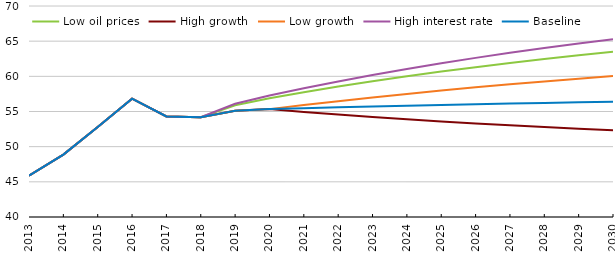
| Category | Low oil prices | High growth | Low growth | High interest rate | Baseline |
|---|---|---|---|---|---|
| 2013-01-01 | 45.886 | 45.886 | 45.886 | 45.886 | 45.886 |
| 2014-01-01 | 48.868 | 48.868 | 48.868 | 48.868 | 48.868 |
| 2015-01-01 | 52.802 | 52.802 | 52.802 | 52.802 | 52.802 |
| 2016-01-01 | 56.825 | 56.825 | 56.825 | 56.825 | 56.825 |
| 2017-01-01 | 54.294 | 54.294 | 54.294 | 54.294 | 54.294 |
| 2018-01-01 | 54.181 | 54.181 | 54.181 | 54.181 | 54.181 |
| 2019-01-01 | 55.891 | 55.091 | 55.091 | 56.091 | 55.091 |
| 2020-01-01 | 56.894 | 55.338 | 55.338 | 57.283 | 55.338 |
| 2021-01-01 | 57.741 | 54.936 | 55.92 | 58.308 | 55.473 |
| 2022-01-01 | 58.539 | 54.561 | 56.473 | 59.274 | 55.6 |
| 2023-01-01 | 59.293 | 54.211 | 57 | 60.186 | 55.72 |
| 2024-01-01 | 60.004 | 53.885 | 57.501 | 61.046 | 55.833 |
| 2025-01-01 | 60.674 | 53.579 | 57.978 | 61.858 | 55.939 |
| 2026-01-01 | 61.307 | 53.295 | 58.431 | 62.624 | 56.04 |
| 2027-01-01 | 61.904 | 53.029 | 58.863 | 63.346 | 56.135 |
| 2028-01-01 | 62.467 | 52.78 | 59.274 | 64.027 | 56.224 |
| 2029-01-01 | 62.998 | 52.548 | 59.664 | 64.67 | 56.309 |
| 2030-01-01 | 63.499 | 52.332 | 60.036 | 65.277 | 56.389 |